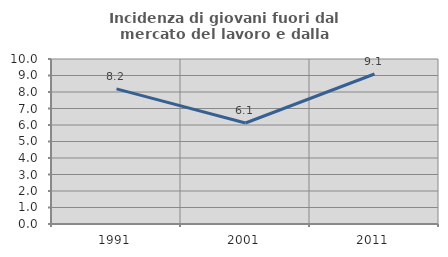
| Category | Incidenza di giovani fuori dal mercato del lavoro e dalla formazione  |
|---|---|
| 1991.0 | 8.187 |
| 2001.0 | 6.122 |
| 2011.0 | 9.091 |